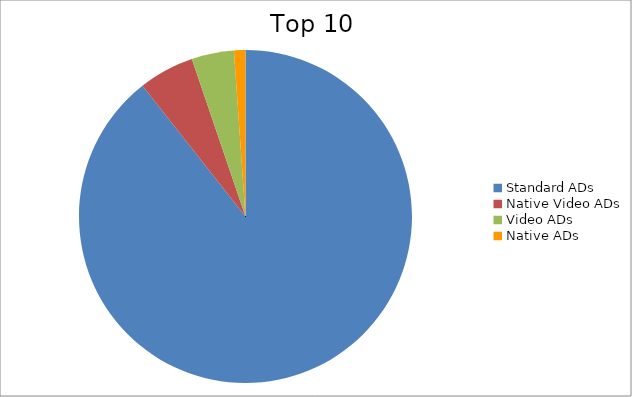
| Category | Series 0 |
|---|---|
| Standard ADs | 89.38 |
| Native Video ADs | 5.4 |
| Video ADs | 4.11 |
| Native ADs | 1.11 |